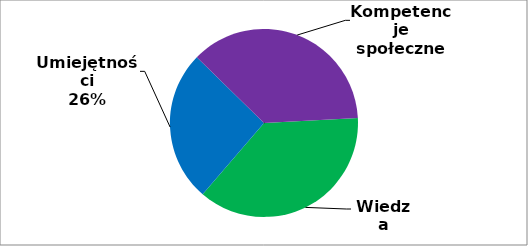
| Category | Series 0 |
|---|---|
| 0 | 120 |
| 1 | 84 |
| 2 | 119 |